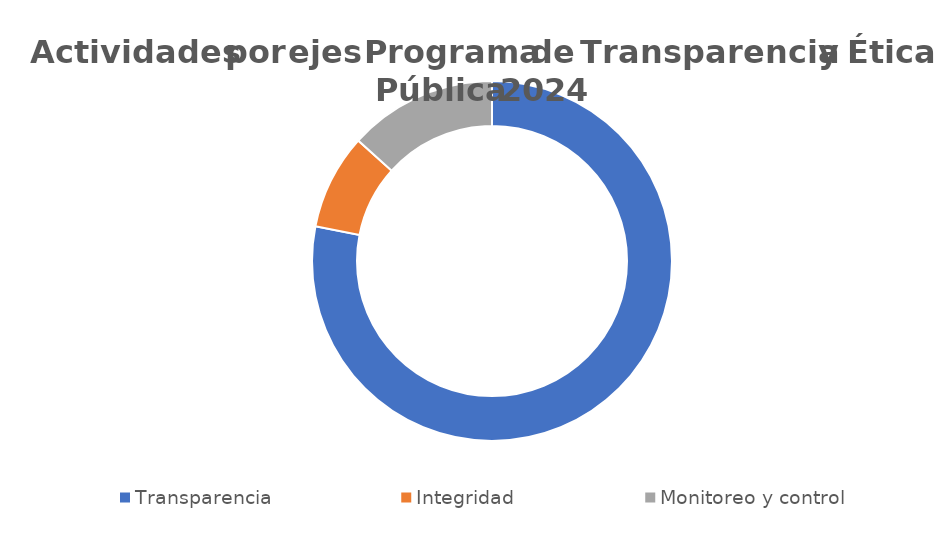
| Category | Series 0 |
|---|---|
| Transparencia | 82 |
| Integridad | 9 |
| Monitoreo y control | 14 |